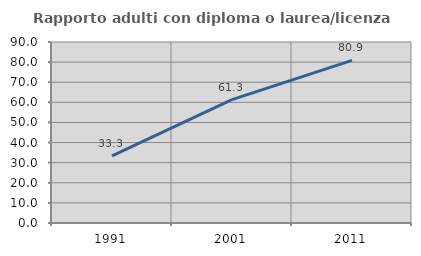
| Category | Rapporto adulti con diploma o laurea/licenza media  |
|---|---|
| 1991.0 | 33.333 |
| 2001.0 | 61.338 |
| 2011.0 | 80.867 |